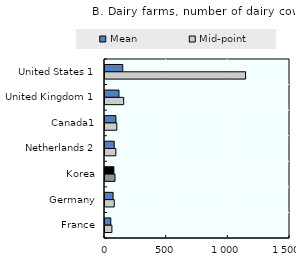
| Category | Mean | Mid-point |
|---|---|---|
| United States 1 | 144 | 1140 |
| United Kingdom 1 | 113.1 | 151.5 |
| Canada1 | 88.595 | 96 |
| Netherlands 2 | 74.66 | 88 |
| Korea | 72 | 81 |
| Germany | 65.676 | 75 |
| France | 47 | 56 |